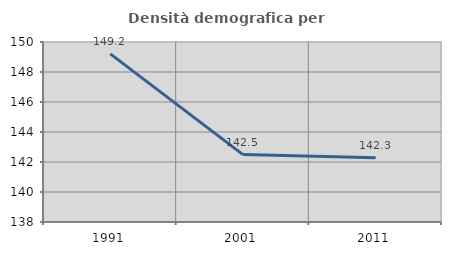
| Category | Densità demografica |
|---|---|
| 1991.0 | 149.212 |
| 2001.0 | 142.493 |
| 2011.0 | 142.283 |